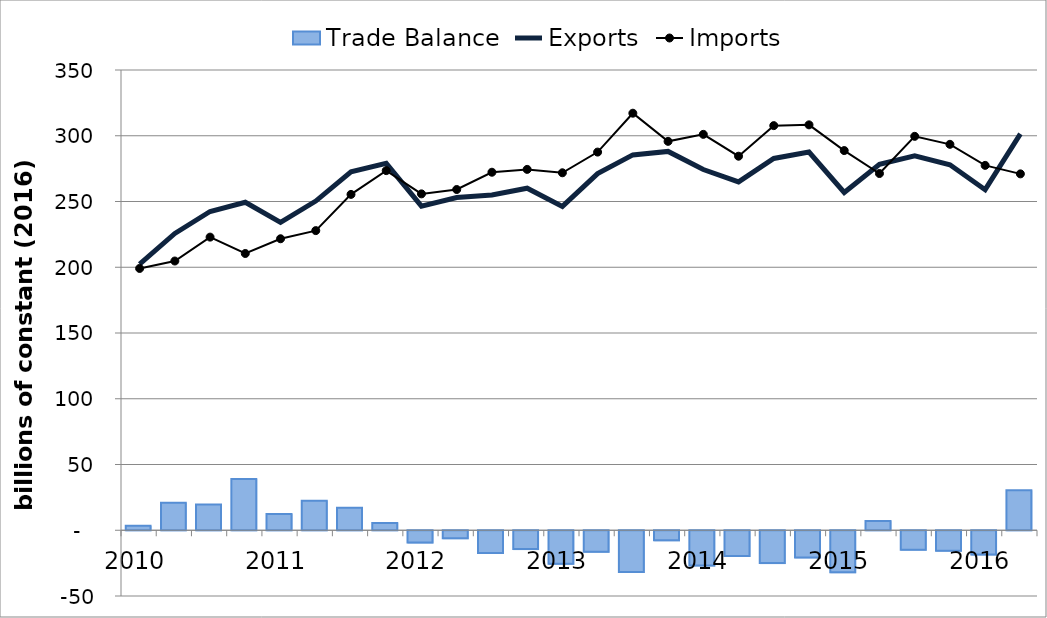
| Category | Trade Balance |
|---|---|
| 2010.0 | 3.347 |
| nan | 20.949 |
| nan | 19.5 |
| nan | 38.964 |
| 2011.0 | 12.385 |
| nan | 22.46 |
| nan | 17.107 |
| nan | 5.533 |
| 2012.0 | -9.362 |
| nan | -6.075 |
| nan | -17.274 |
| nan | -14.33 |
| 2013.0 | -25.552 |
| nan | -16.385 |
| nan | -31.711 |
| nan | -7.653 |
| 2014.0 | -26.767 |
| nan | -19.518 |
| nan | -24.988 |
| nan | -20.64 |
| 2015.0 | -31.903 |
| nan | 6.961 |
| nan | -14.79 |
| nan | -15.543 |
| 2016.0 | -18.49 |
| nan | 30.377 |